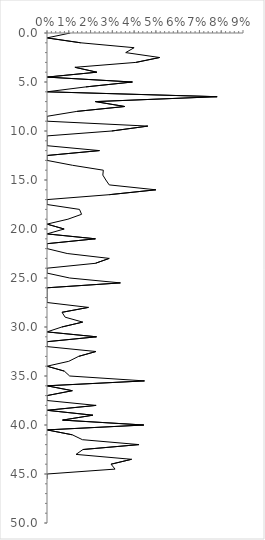
| Category | Series 0 |
|---|---|
| 0.0106951871657754 | 0 |
| 0.0 | 0.5 |
| 0.015503875968992248 | 1 |
| 0.04 | 1.5 |
| 0.03614457831325301 | 2 |
| 0.05172413793103448 | 2.5 |
| 0.04081632653061224 | 3 |
| 0.01282051282051282 | 3.5 |
| 0.022900763358778626 | 4 |
| 0.0 | 4.5 |
| 0.0392156862745098 | 5 |
| 0.017857142857142856 | 5.5 |
| 0.0 | 6 |
| 0.078125 | 6.5 |
| 0.022222222222222223 | 7 |
| 0.03571428571428571 | 7.5 |
| 0.0136986301369863 | 8 |
| 0.0 | 8.5 |
| 0.0 | 9 |
| 0.046296296296296294 | 9.5 |
| 0.0297029702970297 | 10 |
| 0.0 | 10.5 |
| 0.0 | 11 |
| 0.0 | 11.5 |
| 0.024096385542168676 | 12 |
| 0.0 | 12.5 |
| 0.0 | 13 |
| 0.011764705882352941 | 13.5 |
| 0.02586206896551724 | 14 |
| 0.02564102564102564 | 14.5 |
| 0.02702702702702703 | 15 |
| 0.02857142857142857 | 15.5 |
| 0.05 | 16 |
| 0.02857142857142857 | 16.5 |
| 0.0 | 17 |
| 0.0 | 17.5 |
| 0.014925373134328358 | 18 |
| 0.015873015873015872 | 18.5 |
| 0.009615384615384616 | 19 |
| 0.0 | 19.5 |
| 0.007874015748031496 | 20 |
| 0.0 | 20.5 |
| 0.022222222222222223 | 21 |
| 0.0 | 21.5 |
| 0.0 | 22 |
| 0.009259259259259259 | 22.5 |
| 0.02857142857142857 | 23 |
| 0.022222222222222223 | 23.5 |
| 0.0 | 24 |
| 0.0 | 24.5 |
| 0.010416666666666666 | 25 |
| 0.033707865168539325 | 25.5 |
| 0.0 | 26 |
| 0.0 | 26.5 |
| 0.0 | 27 |
| 0.0 | 27.5 |
| 0.01904761904761905 | 28 |
| 0.006896551724137931 | 28.5 |
| 0.008333333333333333 | 29 |
| 0.01639344262295082 | 29.5 |
| 0.006802721088435374 | 30 |
| 0.0 | 30.5 |
| 0.022727272727272728 | 31 |
| 0.0 | 31.5 |
| 0.0 | 32 |
| 0.02247191011235955 | 32.5 |
| 0.014492753623188406 | 33 |
| 0.01 | 33.5 |
| 0.0 | 34 |
| 0.007936507936507936 | 34.5 |
| 0.010416666666666666 | 35 |
| 0.04477611940298507 | 35.5 |
| 0.0 | 36 |
| 0.011627906976744186 | 36.5 |
| 0.0 | 37 |
| 0.0 | 37.5 |
| 0.022556390977443608 | 38 |
| 0.0 | 38.5 |
| 0.021052631578947368 | 39 |
| 0.007142857142857143 | 39.5 |
| 0.044444444444444446 | 40 |
| 0.0 | 40.5 |
| 0.011627906976744186 | 41 |
| 0.016260162601626018 | 41.5 |
| 0.04225352112676056 | 42 |
| 0.01652892561983471 | 42.5 |
| 0.013333333333333334 | 43 |
| 0.038834951456310676 | 43.5 |
| 0.029411764705882353 | 44 |
| 0.03125 | 44.5 |
| 0.0 | 45 |
| 0.0 | 45.5 |